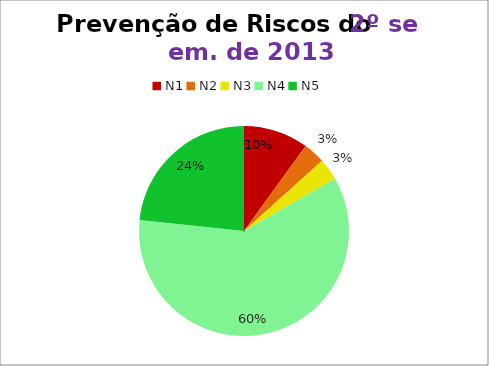
| Category | 2º/13 |
|---|---|
| N1 | 3 |
| N2 | 1 |
| N3 | 1 |
| N4 | 18 |
| N5 | 7 |